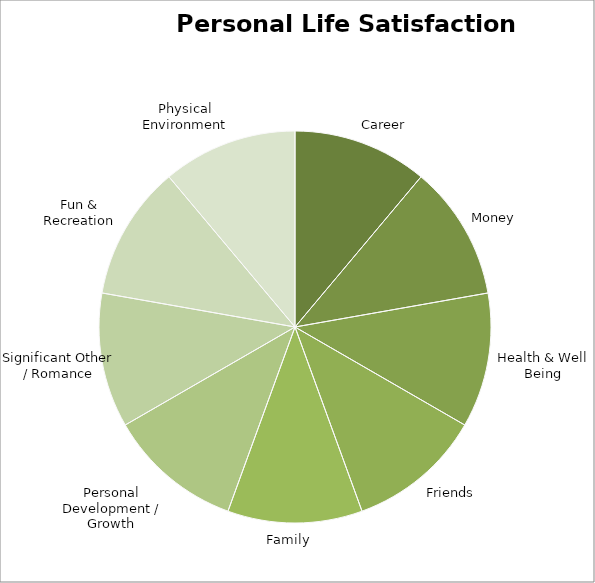
| Category | Series 0 |
|---|---|
| Career | 0.111 |
| Money | 0.111 |
| Health & Well Being | 0.111 |
| Friends | 0.111 |
| Family   | 0.111 |
| Personal Development / Growth | 0.111 |
| Significant Other / Romance | 0.111 |
| Fun & Recreation | 0.111 |
| Physical Environment | 0.111 |